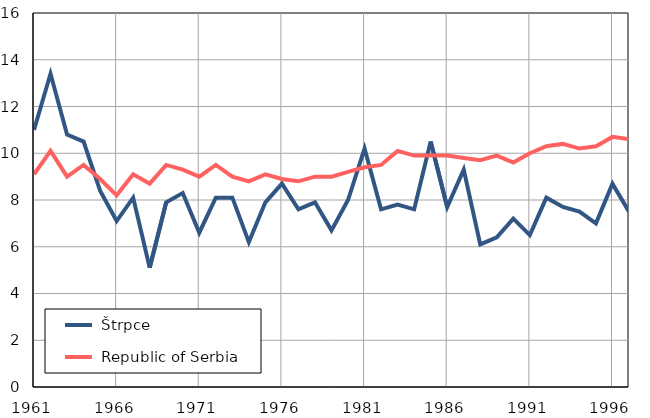
| Category |  Štrpce |  Republic of Serbia |
|---|---|---|
| 1961.0 | 11 | 9.1 |
| 1962.0 | 13.4 | 10.1 |
| 1963.0 | 10.8 | 9 |
| 1964.0 | 10.5 | 9.5 |
| 1965.0 | 8.4 | 8.9 |
| 1966.0 | 7.1 | 8.2 |
| 1967.0 | 8.1 | 9.1 |
| 1968.0 | 5.1 | 8.7 |
| 1969.0 | 7.9 | 9.5 |
| 1970.0 | 8.3 | 9.3 |
| 1971.0 | 6.6 | 9 |
| 1972.0 | 8.1 | 9.5 |
| 1973.0 | 8.1 | 9 |
| 1974.0 | 6.2 | 8.8 |
| 1975.0 | 7.9 | 9.1 |
| 1976.0 | 8.7 | 8.9 |
| 1977.0 | 7.6 | 8.8 |
| 1978.0 | 7.9 | 9 |
| 1979.0 | 6.7 | 9 |
| 1980.0 | 8 | 9.2 |
| 1981.0 | 10.2 | 9.4 |
| 1982.0 | 7.6 | 9.5 |
| 1983.0 | 7.8 | 10.1 |
| 1984.0 | 7.6 | 9.9 |
| 1985.0 | 10.5 | 9.9 |
| 1986.0 | 7.7 | 9.9 |
| 1987.0 | 9.3 | 9.8 |
| 1988.0 | 6.1 | 9.7 |
| 1989.0 | 6.4 | 9.9 |
| 1990.0 | 7.2 | 9.6 |
| 1991.0 | 6.5 | 10 |
| 1992.0 | 8.1 | 10.3 |
| 1993.0 | 7.7 | 10.4 |
| 1994.0 | 7.5 | 10.2 |
| 1995.0 | 7 | 10.3 |
| 1996.0 | 8.7 | 10.7 |
| 1997.0 | 7.5 | 10.6 |